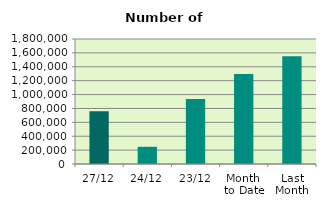
| Category | Series 0 |
|---|---|
| 27/12 | 760888 |
| 24/12 | 247648 |
| 23/12 | 936292 |
| Month 
to Date | 1296175.895 |
| Last
Month | 1553278.182 |